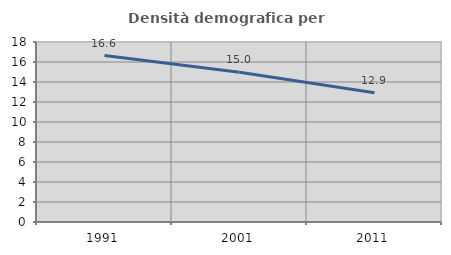
| Category | Densità demografica |
|---|---|
| 1991.0 | 16.642 |
| 2001.0 | 14.981 |
| 2011.0 | 12.933 |